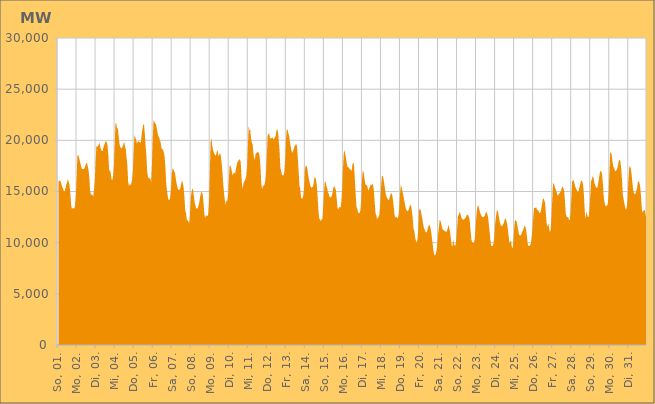
| Category | Series 0 |
|---|---|
|  So, 01.  | 15943.981 |
|  So, 01.  | 16059.611 |
|  So, 01.  | 16056.766 |
|  So, 01.  | 15969.969 |
|  So, 01.  | 15640.852 |
|  So, 01.  | 15417.604 |
|  So, 01.  | 15261.036 |
|  So, 01.  | 14991.259 |
|  So, 01.  | 15050.002 |
|  So, 01.  | 15347.856 |
|  So, 01.  | 15693.621 |
|  So, 01.  | 15903.092 |
|  So, 01.  | 16207.021 |
|  So, 01.  | 15935.751 |
|  So, 01.  | 15648.858 |
|  So, 01.  | 14876.614 |
|  So, 01.  | 13732.445 |
|  Mo, 02.  | 13315.707 |
|  Mo, 02.  | 13358.309 |
|  Mo, 02.  | 13378.894 |
|  Mo, 02.  | 13326.654 |
|  Mo, 02.  | 13590.239 |
|  Mo, 02.  | 14529.958 |
|  Mo, 02.  | 16507.465 |
|  Mo, 02.  | 18540.311 |
|  Mo, 02.  | 18581.93 |
|  Mo, 02.  | 18305.72 |
|  Mo, 02.  | 18024.44 |
|  Mo, 02.  | 17672.658 |
|  Mo, 02.  | 17371.76 |
|  Mo, 02.  | 17149.144 |
|  Mo, 02.  | 17225.176 |
|  Mo, 02.  | 17154.51 |
|  Mo, 02.  | 17287.871 |
|  Mo, 02.  | 17537.795 |
|  Mo, 02.  | 17761.107 |
|  Mo, 02.  | 17805.675 |
|  Mo, 02.  | 17479.216 |
|  Mo, 02.  | 17102.393 |
|  Mo, 02.  | 16335.689 |
|  Mo, 02.  | 15102.402 |
|  Di, 03.  | 14703.126 |
|  Di, 03.  | 14709.047 |
|  Di, 03.  | 14653.236 |
|  Di, 03.  | 14517.628 |
|  Di, 03.  | 15238.616 |
|  Di, 03.  | 16154.799 |
|  Di, 03.  | 18087.855 |
|  Di, 03.  | 19485.796 |
|  Di, 03.  | 19347.858 |
|  Di, 03.  | 19446.824 |
|  Di, 03.  | 19603.002 |
|  Di, 03.  | 19758.304 |
|  Di, 03.  | 19282.406 |
|  Di, 03.  | 19050.729 |
|  Di, 03.  | 18954.229 |
|  Di, 03.  | 18956.25 |
|  Di, 03.  | 19386.553 |
|  Di, 03.  | 19571.253 |
|  Di, 03.  | 19815.115 |
|  Di, 03.  | 19937.038 |
|  Di, 03.  | 19820.429 |
|  Di, 03.  | 19492.194 |
|  Di, 03.  | 18552.215 |
|  Di, 03.  | 17136.571 |
|  Mi, 04.  | 17006.877 |
|  Mi, 04.  | 16825.427 |
|  Mi, 04.  | 16153.125 |
|  Mi, 04.  | 16117.1 |
|  Mi, 04.  | 16468.32 |
|  Mi, 04.  | 17508.315 |
|  Mi, 04.  | 19583.169 |
|  Mi, 04.  | 21688.049 |
|  Mi, 04.  | 21637.305 |
|  Mi, 04.  | 21169.4 |
|  Mi, 04.  | 21149.513 |
|  Mi, 04.  | 20445.642 |
|  Mi, 04.  | 19670.266 |
|  Mi, 04.  | 19330.397 |
|  Mi, 04.  | 19250.036 |
|  Mi, 04.  | 19205.048 |
|  Mi, 04.  | 19394.908 |
|  Mi, 04.  | 19628.711 |
|  Mi, 04.  | 19862.724 |
|  Mi, 04.  | 19370.143 |
|  Mi, 04.  | 19149.953 |
|  Mi, 04.  | 18343.378 |
|  Mi, 04.  | 17514.768 |
|  Mi, 04.  | 15957.605 |
|  Do, 05.  | 15505.066 |
|  Do, 05.  | 15784.264 |
|  Do, 05.  | 15596.427 |
|  Do, 05.  | 15815.001 |
|  Do, 05.  | 16164.535 |
|  Do, 05.  | 17049.308 |
|  Do, 05.  | 18979.767 |
|  Do, 05.  | 20531.666 |
|  Do, 05.  | 20307.739 |
|  Do, 05.  | 20065.3 |
|  Do, 05.  | 19694.745 |
|  Do, 05.  | 19848.568 |
|  Do, 05.  | 19926.244 |
|  Do, 05.  | 19828.837 |
|  Do, 05.  | 19805.809 |
|  Do, 05.  | 19782.397 |
|  Do, 05.  | 20515.488 |
|  Do, 05.  | 21110.191 |
|  Do, 05.  | 21547.327 |
|  Do, 05.  | 21552.333 |
|  Do, 05.  | 20671.734 |
|  Do, 05.  | 19503.529 |
|  Do, 05.  | 18514.131 |
|  Do, 05.  | 16982.104 |
|  Fr, 06.  | 16426.338 |
|  Fr, 06.  | 16306.31 |
|  Fr, 06.  | 16268.957 |
|  Fr, 06.  | 16261.99 |
|  Fr, 06.  | 15931.045 |
|  Fr, 06.  | 17603.823 |
|  Fr, 06.  | 20093.46 |
|  Fr, 06.  | 21968.08 |
|  Fr, 06.  | 21826.581 |
|  Fr, 06.  | 21676.879 |
|  Fr, 06.  | 21588.891 |
|  Fr, 06.  | 21232.422 |
|  Fr, 06.  | 20763.898 |
|  Fr, 06.  | 20420.063 |
|  Fr, 06.  | 20321.782 |
|  Fr, 06.  | 20022.07 |
|  Fr, 06.  | 19792.47 |
|  Fr, 06.  | 19196.258 |
|  Fr, 06.  | 19117.936 |
|  Fr, 06.  | 19115.27 |
|  Fr, 06.  | 18802.357 |
|  Fr, 06.  | 18350.028 |
|  Fr, 06.  | 17409.451 |
|  Fr, 06.  | 15755.223 |
|  Sa, 07.  | 15087.711 |
|  Sa, 07.  | 14503.548 |
|  Sa, 07.  | 14159.067 |
|  Sa, 07.  | 14167.454 |
|  Sa, 07.  | 14380.725 |
|  Sa, 07.  | 15194.601 |
|  Sa, 07.  | 16690.224 |
|  Sa, 07.  | 17255.088 |
|  Sa, 07.  | 17177.904 |
|  Sa, 07.  | 16978.118 |
|  Sa, 07.  | 16840.281 |
|  Sa, 07.  | 16308.887 |
|  Sa, 07.  | 15834.006 |
|  Sa, 07.  | 15462.168 |
|  Sa, 07.  | 15209.025 |
|  Sa, 07.  | 15150.507 |
|  Sa, 07.  | 15174.801 |
|  Sa, 07.  | 15379.553 |
|  Sa, 07.  | 15769.877 |
|  Sa, 07.  | 16082.259 |
|  Sa, 07.  | 15822.208 |
|  Sa, 07.  | 15369.057 |
|  Sa, 07.  | 14473.337 |
|  Sa, 07.  | 13123.831 |
|  So, 08.  | 12872.489 |
|  So, 08.  | 12270.136 |
|  So, 08.  | 12157.79 |
|  So, 08.  | 12063.878 |
|  So, 08.  | 11878.559 |
|  So, 08.  | 12751.103 |
|  So, 08.  | 14431.377 |
|  So, 08.  | 14960.947 |
|  So, 08.  | 15308.072 |
|  So, 08.  | 15107.571 |
|  So, 08.  | 14481.589 |
|  So, 08.  | 13910.589 |
|  So, 08.  | 13587.699 |
|  So, 08.  | 13331.323 |
|  So, 08.  | 13320.009 |
|  So, 08.  | 13441.317 |
|  So, 08.  | 13714.737 |
|  So, 08.  | 14049.417 |
|  So, 08.  | 14568.559 |
|  So, 08.  | 14891.88 |
|  So, 08.  | 14933.486 |
|  So, 08.  | 14716.002 |
|  So, 08.  | 13972.899 |
|  So, 08.  | 12884.061 |
|  Mo, 09.  | 12422.884 |
|  Mo, 09.  | 12634.3 |
|  Mo, 09.  | 12645.966 |
|  Mo, 09.  | 12588.301 |
|  Mo, 09.  | 12782.265 |
|  Mo, 09.  | 13998.167 |
|  Mo, 09.  | 16782.493 |
|  Mo, 09.  | 19810.31 |
|  Mo, 09.  | 20199.241 |
|  Mo, 09.  | 19529.853 |
|  Mo, 09.  | 19082.604 |
|  Mo, 09.  | 18821.025 |
|  Mo, 09.  | 18655.766 |
|  Mo, 09.  | 18484.933 |
|  Mo, 09.  | 18615.638 |
|  Mo, 09.  | 18897.899 |
|  Mo, 09.  | 19040.242 |
|  Mo, 09.  | 18421.949 |
|  Mo, 09.  | 18644.385 |
|  Mo, 09.  | 18724.891 |
|  Mo, 09.  | 18437.791 |
|  Mo, 09.  | 17716.123 |
|  Mo, 09.  | 16842.213 |
|  Mo, 09.  | 15668.447 |
|  Di, 10.  | 14843.888 |
|  Di, 10.  | 14116.222 |
|  Di, 10.  | 13705.998 |
|  Di, 10.  | 14119.115 |
|  Di, 10.  | 14071.542 |
|  Di, 10.  | 14575.265 |
|  Di, 10.  | 16129.634 |
|  Di, 10.  | 17522.142 |
|  Di, 10.  | 17516.538 |
|  Di, 10.  | 17275.242 |
|  Di, 10.  | 16840.556 |
|  Di, 10.  | 16564.059 |
|  Di, 10.  | 16802.13 |
|  Di, 10.  | 16833.282 |
|  Di, 10.  | 16752.058 |
|  Di, 10.  | 17246.275 |
|  Di, 10.  | 17635.011 |
|  Di, 10.  | 17875.362 |
|  Di, 10.  | 17987.522 |
|  Di, 10.  | 18111.096 |
|  Di, 10.  | 18144.002 |
|  Di, 10.  | 17855.638 |
|  Di, 10.  | 16444.918 |
|  Di, 10.  | 15283.262 |
|  Mi, 11.  | 15567.831 |
|  Mi, 11.  | 15926.504 |
|  Mi, 11.  | 16063.968 |
|  Mi, 11.  | 16196.813 |
|  Mi, 11.  | 16527.421 |
|  Mi, 11.  | 17361.377 |
|  Mi, 11.  | 19285.476 |
|  Mi, 11.  | 21385.288 |
|  Mi, 11.  | 21008.263 |
|  Mi, 11.  | 21029.407 |
|  Mi, 11.  | 20217.617 |
|  Mi, 11.  | 19793.564 |
|  Mi, 11.  | 19601.193 |
|  Mi, 11.  | 18767.613 |
|  Mi, 11.  | 18085.423 |
|  Mi, 11.  | 18282.659 |
|  Mi, 11.  | 18720.042 |
|  Mi, 11.  | 18753.35 |
|  Mi, 11.  | 18850.771 |
|  Mi, 11.  | 18833.382 |
|  Mi, 11.  | 18770.665 |
|  Mi, 11.  | 18294.654 |
|  Mi, 11.  | 17315.81 |
|  Mi, 11.  | 15700.337 |
|  Do, 12.  | 15251.681 |
|  Do, 12.  | 15548.252 |
|  Do, 12.  | 15571.722 |
|  Do, 12.  | 15671.154 |
|  Do, 12.  | 16039.389 |
|  Do, 12.  | 16963.912 |
|  Do, 12.  | 18708.964 |
|  Do, 12.  | 20534.095 |
|  Do, 12.  | 20604.368 |
|  Do, 12.  | 20668.949 |
|  Do, 12.  | 20112.018 |
|  Do, 12.  | 20285.17 |
|  Do, 12.  | 20181.557 |
|  Do, 12.  | 20287.538 |
|  Do, 12.  | 20125.009 |
|  Do, 12.  | 20104.944 |
|  Do, 12.  | 20319.508 |
|  Do, 12.  | 20390.403 |
|  Do, 12.  | 20902.852 |
|  Do, 12.  | 21120.876 |
|  Do, 12.  | 20830.689 |
|  Do, 12.  | 19952.955 |
|  Do, 12.  | 18921.295 |
|  Do, 12.  | 17341.378 |
|  Fr, 13.  | 17005.033 |
|  Fr, 13.  | 16619.518 |
|  Fr, 13.  | 16578.184 |
|  Fr, 13.  | 16575.311 |
|  Fr, 13.  | 16920.648 |
|  Fr, 13.  | 17917.112 |
|  Fr, 13.  | 19909.03 |
|  Fr, 13.  | 21036.803 |
|  Fr, 13.  | 21071.97 |
|  Fr, 13.  | 20719.85 |
|  Fr, 13.  | 20449.309 |
|  Fr, 13.  | 19899.856 |
|  Fr, 13.  | 19400.697 |
|  Fr, 13.  | 18999.155 |
|  Fr, 13.  | 18758.931 |
|  Fr, 13.  | 18956.528 |
|  Fr, 13.  | 19173.574 |
|  Fr, 13.  | 19420.57 |
|  Fr, 13.  | 19549.293 |
|  Fr, 13.  | 19669.883 |
|  Fr, 13.  | 19394.907 |
|  Fr, 13.  | 18259.304 |
|  Fr, 13.  | 17017.554 |
|  Fr, 13.  | 15572.806 |
|  Sa, 14.  | 15327.11 |
|  Sa, 14.  | 14446.692 |
|  Sa, 14.  | 14296.605 |
|  Sa, 14.  | 14312.044 |
|  Sa, 14.  | 14660.425 |
|  Sa, 14.  | 15439.954 |
|  Sa, 14.  | 17171.983 |
|  Sa, 14.  | 17513.033 |
|  Sa, 14.  | 17509.075 |
|  Sa, 14.  | 17244.128 |
|  Sa, 14.  | 16633.825 |
|  Sa, 14.  | 16216.29 |
|  Sa, 14.  | 15843.436 |
|  Sa, 14.  | 15488.95 |
|  Sa, 14.  | 15383.753 |
|  Sa, 14.  | 15399.231 |
|  Sa, 14.  | 15485.773 |
|  Sa, 14.  | 15772.093 |
|  Sa, 14.  | 16368.013 |
|  Sa, 14.  | 16401.743 |
|  Sa, 14.  | 16132.853 |
|  Sa, 14.  | 15627.452 |
|  Sa, 14.  | 14466.78 |
|  Sa, 14.  | 13137.016 |
|  So, 15.  | 12341.364 |
|  So, 15.  | 12291.233 |
|  So, 15.  | 12107.094 |
|  So, 15.  | 12266.288 |
|  So, 15.  | 12302.88 |
|  So, 15.  | 13390.213 |
|  So, 15.  | 14820.448 |
|  So, 15.  | 15989.601 |
|  So, 15.  | 15933.895 |
|  So, 15.  | 15570.225 |
|  So, 15.  | 15310.158 |
|  So, 15.  | 14912.32 |
|  So, 15.  | 14782.41 |
|  So, 15.  | 14483.991 |
|  So, 15.  | 14406.682 |
|  So, 15.  | 14473.836 |
|  So, 15.  | 14592.271 |
|  So, 15.  | 14972.776 |
|  So, 15.  | 15410.839 |
|  So, 15.  | 15507.577 |
|  So, 15.  | 15367.43 |
|  So, 15.  | 15126.391 |
|  So, 15.  | 14380.464 |
|  So, 15.  | 13403.202 |
|  Mo, 16.  | 13233.008 |
|  Mo, 16.  | 13458.513 |
|  Mo, 16.  | 13467.386 |
|  Mo, 16.  | 13472.985 |
|  Mo, 16.  | 14040.472 |
|  Mo, 16.  | 15251.499 |
|  Mo, 16.  | 17271.306 |
|  Mo, 16.  | 18818.491 |
|  Mo, 16.  | 19019.327 |
|  Mo, 16.  | 18584.975 |
|  Mo, 16.  | 18131.729 |
|  Mo, 16.  | 17642.708 |
|  Mo, 16.  | 17362.041 |
|  Mo, 16.  | 17399.597 |
|  Mo, 16.  | 17214.943 |
|  Mo, 16.  | 17218.894 |
|  Mo, 16.  | 17017.561 |
|  Mo, 16.  | 17071.129 |
|  Mo, 16.  | 17694.022 |
|  Mo, 16.  | 17824.227 |
|  Mo, 16.  | 17535.878 |
|  Mo, 16.  | 16141.108 |
|  Mo, 16.  | 14727.661 |
|  Mo, 16.  | 13494.733 |
|  Di, 17.  | 13320.601 |
|  Di, 17.  | 12941.478 |
|  Di, 17.  | 12900.312 |
|  Di, 17.  | 12911.102 |
|  Di, 17.  | 13161.651 |
|  Di, 17.  | 14145.875 |
|  Di, 17.  | 16183.056 |
|  Di, 17.  | 17058.991 |
|  Di, 17.  | 16905.803 |
|  Di, 17.  | 16346.023 |
|  Di, 17.  | 15825.46 |
|  Di, 17.  | 15584.733 |
|  Di, 17.  | 15656.3 |
|  Di, 17.  | 15395.446 |
|  Di, 17.  | 15068.423 |
|  Di, 17.  | 15314.45 |
|  Di, 17.  | 15437.81 |
|  Di, 17.  | 15717.061 |
|  Di, 17.  | 15599.78 |
|  Di, 17.  | 15733.478 |
|  Di, 17.  | 15654.391 |
|  Di, 17.  | 14991.971 |
|  Di, 17.  | 13965.324 |
|  Di, 17.  | 12862.739 |
|  Mi, 18.  | 12682.419 |
|  Mi, 18.  | 12291.413 |
|  Mi, 18.  | 12425.471 |
|  Mi, 18.  | 12515.757 |
|  Mi, 18.  | 12810.587 |
|  Mi, 18.  | 13699.317 |
|  Mi, 18.  | 15379.826 |
|  Mi, 18.  | 16475.554 |
|  Mi, 18.  | 16551.444 |
|  Mi, 18.  | 16261.142 |
|  Mi, 18.  | 15815.374 |
|  Mi, 18.  | 15221.64 |
|  Mi, 18.  | 14742.035 |
|  Mi, 18.  | 14479.711 |
|  Mi, 18.  | 14318.198 |
|  Mi, 18.  | 14178.757 |
|  Mi, 18.  | 14164.977 |
|  Mi, 18.  | 14444.014 |
|  Mi, 18.  | 14754.079 |
|  Mi, 18.  | 14836.676 |
|  Mi, 18.  | 14702.254 |
|  Mi, 18.  | 14205.531 |
|  Mi, 18.  | 13557.639 |
|  Mi, 18.  | 12702.116 |
|  Do, 19.  | 12486.24 |
|  Do, 19.  | 12524.275 |
|  Do, 19.  | 12435.528 |
|  Do, 19.  | 12385.679 |
|  Do, 19.  | 12605.846 |
|  Do, 19.  | 13416.494 |
|  Do, 19.  | 14818.259 |
|  Do, 19.  | 15644.443 |
|  Do, 19.  | 15391.953 |
|  Do, 19.  | 14999.994 |
|  Do, 19.  | 14677.283 |
|  Do, 19.  | 14224.834 |
|  Do, 19.  | 13865.159 |
|  Do, 19.  | 13403.713 |
|  Do, 19.  | 13206.209 |
|  Do, 19.  | 13106.753 |
|  Do, 19.  | 13052.58 |
|  Do, 19.  | 13263.187 |
|  Do, 19.  | 13569.962 |
|  Do, 19.  | 13690.755 |
|  Do, 19.  | 13568.653 |
|  Do, 19.  | 13008.16 |
|  Do, 19.  | 12387.198 |
|  Do, 19.  | 11336.779 |
|  Fr, 20.  | 11158.566 |
|  Fr, 20.  | 10503.083 |
|  Fr, 20.  | 10197.453 |
|  Fr, 20.  | 9991.052 |
|  Fr, 20.  | 10363.803 |
|  Fr, 20.  | 11367.766 |
|  Fr, 20.  | 13149.279 |
|  Fr, 20.  | 13319.352 |
|  Fr, 20.  | 13164.211 |
|  Fr, 20.  | 12753.807 |
|  Fr, 20.  | 12396.396 |
|  Fr, 20.  | 11857.538 |
|  Fr, 20.  | 11461.588 |
|  Fr, 20.  | 11293.374 |
|  Fr, 20.  | 11042.83 |
|  Fr, 20.  | 10990.137 |
|  Fr, 20.  | 11077.385 |
|  Fr, 20.  | 11450.12 |
|  Fr, 20.  | 11627.617 |
|  Fr, 20.  | 11748.054 |
|  Fr, 20.  | 11571.617 |
|  Fr, 20.  | 11207.555 |
|  Fr, 20.  | 10579.176 |
|  Fr, 20.  | 9972.259 |
|  Sa, 21.  | 9265.342 |
|  Sa, 21.  | 8848.981 |
|  Sa, 21.  | 8741.992 |
|  Sa, 21.  | 8896.62 |
|  Sa, 21.  | 9194.476 |
|  Sa, 21.  | 9900.384 |
|  Sa, 21.  | 10856.578 |
|  Sa, 21.  | 11502.691 |
|  Sa, 21.  | 12254.598 |
|  Sa, 21.  | 12124.549 |
|  Sa, 21.  | 11843.243 |
|  Sa, 21.  | 11471.736 |
|  Sa, 21.  | 11253.326 |
|  Sa, 21.  | 11247.854 |
|  Sa, 21.  | 11149.557 |
|  Sa, 21.  | 11145.48 |
|  Sa, 21.  | 10997.02 |
|  Sa, 21.  | 11136.049 |
|  Sa, 21.  | 11364.606 |
|  Sa, 21.  | 11725.065 |
|  Sa, 21.  | 11456.065 |
|  Sa, 21.  | 11102.499 |
|  Sa, 21.  | 10444.769 |
|  Sa, 21.  | 9789.935 |
|  So, 22.  | 9634.111 |
|  So, 22.  | 10314.37 |
|  So, 22.  | 9880.996 |
|  So, 22.  | 9651.932 |
|  So, 22.  | 9790.462 |
|  So, 22.  | 10370.518 |
|  So, 22.  | 11468.838 |
|  So, 22.  | 12584.702 |
|  So, 22.  | 12727.727 |
|  So, 22.  | 13008.285 |
|  So, 22.  | 12880.445 |
|  So, 22.  | 12572.324 |
|  So, 22.  | 12327.144 |
|  So, 22.  | 12288.351 |
|  So, 22.  | 12231.328 |
|  So, 22.  | 12294.718 |
|  So, 22.  | 12378.258 |
|  So, 22.  | 12476.4 |
|  So, 22.  | 12697.514 |
|  So, 22.  | 12728.212 |
|  So, 22.  | 12682.888 |
|  So, 22.  | 12474.981 |
|  So, 22.  | 12050.064 |
|  So, 22.  | 11111.319 |
|  Mo, 23.  | 10292.352 |
|  Mo, 23.  | 10053.997 |
|  Mo, 23.  | 9967.044 |
|  Mo, 23.  | 9959.899 |
|  Mo, 23.  | 10232.483 |
|  Mo, 23.  | 11091.17 |
|  Mo, 23.  | 12310.239 |
|  Mo, 23.  | 13206.392 |
|  Mo, 23.  | 13647.551 |
|  Mo, 23.  | 13573.398 |
|  Mo, 23.  | 13236.717 |
|  Mo, 23.  | 12934.969 |
|  Mo, 23.  | 12709.995 |
|  Mo, 23.  | 12582.412 |
|  Mo, 23.  | 12494.759 |
|  Mo, 23.  | 12485.718 |
|  Mo, 23.  | 12544.326 |
|  Mo, 23.  | 12625.176 |
|  Mo, 23.  | 12954.203 |
|  Mo, 23.  | 13017.287 |
|  Mo, 23.  | 12801.933 |
|  Mo, 23.  | 12485.435 |
|  Mo, 23.  | 11814.086 |
|  Mo, 23.  | 11020.561 |
|  Di, 24.  | 10209.5 |
|  Di, 24.  | 9666.511 |
|  Di, 24.  | 9677.787 |
|  Di, 24.  | 9713.64 |
|  Di, 24.  | 9979.387 |
|  Di, 24.  | 10698.275 |
|  Di, 24.  | 11866.345 |
|  Di, 24.  | 12545.299 |
|  Di, 24.  | 13080.273 |
|  Di, 24.  | 13200.037 |
|  Di, 24.  | 12854.775 |
|  Di, 24.  | 12342.361 |
|  Di, 24.  | 11977.661 |
|  Di, 24.  | 11681.099 |
|  Di, 24.  | 11640.383 |
|  Di, 24.  | 11619.596 |
|  Di, 24.  | 11815.446 |
|  Di, 24.  | 11919.901 |
|  Di, 24.  | 12274.61 |
|  Di, 24.  | 12402.773 |
|  Di, 24.  | 12170.99 |
|  Di, 24.  | 11844.167 |
|  Di, 24.  | 11310.362 |
|  Di, 24.  | 10621.634 |
|  Mi, 25.  | 9890.181 |
|  Mi, 25.  | 10192.018 |
|  Mi, 25.  | 10118.221 |
|  Mi, 25.  | 9573.594 |
|  Mi, 25.  | 9460.667 |
|  Mi, 25.  | 10155.573 |
|  Mi, 25.  | 11374.232 |
|  Mi, 25.  | 12219.712 |
|  Mi, 25.  | 12150.715 |
|  Mi, 25.  | 12096.018 |
|  Mi, 25.  | 11666.912 |
|  Mi, 25.  | 11223.505 |
|  Mi, 25.  | 10811.885 |
|  Mi, 25.  | 10708.716 |
|  Mi, 25.  | 10672.043 |
|  Mi, 25.  | 10840.537 |
|  Mi, 25.  | 11093.812 |
|  Mi, 25.  | 11180.17 |
|  Mi, 25.  | 11451.808 |
|  Mi, 25.  | 11664.076 |
|  Mi, 25.  | 11551.807 |
|  Mi, 25.  | 11274.956 |
|  Mi, 25.  | 10676.24 |
|  Mi, 25.  | 9886.437 |
|  Do, 26.  | 9663.246 |
|  Do, 26.  | 9670.058 |
|  Do, 26.  | 9749.426 |
|  Do, 26.  | 9933.432 |
|  Do, 26.  | 10554.178 |
|  Do, 26.  | 11366.534 |
|  Do, 26.  | 12464.528 |
|  Do, 26.  | 13377.999 |
|  Do, 26.  | 13406.805 |
|  Do, 26.  | 13413.435 |
|  Do, 26.  | 13451.838 |
|  Do, 26.  | 13133.723 |
|  Do, 26.  | 13250.854 |
|  Do, 26.  | 13050.388 |
|  Do, 26.  | 12882.943 |
|  Do, 26.  | 12925.962 |
|  Do, 26.  | 13237.674 |
|  Do, 26.  | 13759.306 |
|  Do, 26.  | 14215.46 |
|  Do, 26.  | 14348.085 |
|  Do, 26.  | 14129.091 |
|  Do, 26.  | 13859.01 |
|  Do, 26.  | 12755.885 |
|  Do, 26.  | 11823.874 |
|  Fr, 27.  | 11541.53 |
|  Fr, 27.  | 11910.06 |
|  Fr, 27.  | 11462.189 |
|  Fr, 27.  | 11001.989 |
|  Fr, 27.  | 11272.598 |
|  Fr, 27.  | 12573.66 |
|  Fr, 27.  | 14247.876 |
|  Fr, 27.  | 15767.086 |
|  Fr, 27.  | 15782.112 |
|  Fr, 27.  | 15505.161 |
|  Fr, 27.  | 15296.258 |
|  Fr, 27.  | 15067.157 |
|  Fr, 27.  | 14794.292 |
|  Fr, 27.  | 14565.192 |
|  Fr, 27.  | 14702.145 |
|  Fr, 27.  | 14823.807 |
|  Fr, 27.  | 14930.624 |
|  Fr, 27.  | 15063.689 |
|  Fr, 27.  | 15335.801 |
|  Fr, 27.  | 15515.935 |
|  Fr, 27.  | 15325.539 |
|  Fr, 27.  | 15008.493 |
|  Fr, 27.  | 14143.707 |
|  Fr, 27.  | 12831.429 |
|  Sa, 28.  | 12547.955 |
|  Sa, 28.  | 12481.644 |
|  Sa, 28.  | 12511.183 |
|  Sa, 28.  | 12285.18 |
|  Sa, 28.  | 12143.575 |
|  Sa, 28.  | 12830.121 |
|  Sa, 28.  | 14230.101 |
|  Sa, 28.  | 15911.189 |
|  Sa, 28.  | 16133.166 |
|  Sa, 28.  | 16086.126 |
|  Sa, 28.  | 15791.94 |
|  Sa, 28.  | 15464.579 |
|  Sa, 28.  | 15284.038 |
|  Sa, 28.  | 15130.038 |
|  Sa, 28.  | 14985.365 |
|  Sa, 28.  | 14983.297 |
|  Sa, 28.  | 15334.53 |
|  Sa, 28.  | 15609.559 |
|  Sa, 28.  | 15990.456 |
|  Sa, 28.  | 16078.387 |
|  Sa, 28.  | 15967.937 |
|  Sa, 28.  | 15584.67 |
|  Sa, 28.  | 14607.063 |
|  Sa, 28.  | 13050.719 |
|  So, 29.  | 12288.75 |
|  So, 29.  | 13063.147 |
|  So, 29.  | 12733.352 |
|  So, 29.  | 12494.265 |
|  So, 29.  | 12576.052 |
|  So, 29.  | 13273.787 |
|  So, 29.  | 14674.299 |
|  So, 29.  | 16023.149 |
|  So, 29.  | 16175.829 |
|  So, 29.  | 16486.353 |
|  So, 29.  | 16385.447 |
|  So, 29.  | 15879.029 |
|  So, 29.  | 15671.649 |
|  So, 29.  | 15403.547 |
|  So, 29.  | 15341.288 |
|  So, 29.  | 15391.729 |
|  So, 29.  | 15804.029 |
|  So, 29.  | 16343.612 |
|  So, 29.  | 16816.733 |
|  So, 29.  | 17043.885 |
|  So, 29.  | 16932.722 |
|  So, 29.  | 16592.779 |
|  So, 29.  | 15599.371 |
|  So, 29.  | 14400.322 |
|  Mo, 30.  | 13923.082 |
|  Mo, 30.  | 13596.007 |
|  Mo, 30.  | 13566.717 |
|  Mo, 30.  | 13648.691 |
|  Mo, 30.  | 13732.894 |
|  Mo, 30.  | 14785.962 |
|  Mo, 30.  | 16723.754 |
|  Mo, 30.  | 18742.828 |
|  Mo, 30.  | 18838.144 |
|  Mo, 30.  | 18557.352 |
|  Mo, 30.  | 17923.305 |
|  Mo, 30.  | 17411.631 |
|  Mo, 30.  | 17322.714 |
|  Mo, 30.  | 17066.755 |
|  Mo, 30.  | 16974.838 |
|  Mo, 30.  | 17090.697 |
|  Mo, 30.  | 17258.67 |
|  Mo, 30.  | 17598.592 |
|  Mo, 30.  | 17980.411 |
|  Mo, 30.  | 18141.802 |
|  Mo, 30.  | 17947.243 |
|  Mo, 30.  | 17199.859 |
|  Mo, 30.  | 16106.603 |
|  Mo, 30.  | 14704.015 |
|  Di, 31.  | 14253.196 |
|  Di, 31.  | 13816.767 |
|  Di, 31.  | 13411.652 |
|  Di, 31.  | 13206.535 |
|  Di, 31.  | 13496.326 |
|  Di, 31.  | 14259.863 |
|  Di, 31.  | 16036.131 |
|  Di, 31.  | 17300.523 |
|  Di, 31.  | 17517.706 |
|  Di, 31.  | 17248.22 |
|  Di, 31.  | 16729.354 |
|  Di, 31.  | 15932.988 |
|  Di, 31.  | 15179.427 |
|  Di, 31.  | 14862.405 |
|  Di, 31.  | 14710.001 |
|  Di, 31.  | 14794.087 |
|  Di, 31.  | 15026.145 |
|  Di, 31.  | 15356.983 |
|  Di, 31.  | 15968.915 |
|  Di, 31.  | 16002.756 |
|  Di, 31.  | 15813.381 |
|  Di, 31.  | 15407.268 |
|  Di, 31.  | 14479.173 |
|  Di, 31.  | 13267.592 |
|  Mi, 01.  | 12933.939 |
|  Mi, 01.  | 13099.267 |
|  Mi, 01.  | 13204.37 |
|  Mi, 01.  | 13123.582 |
|  Mi, 01.  | 12517.907 |
|  Mi, 01.  | 13156.885 |